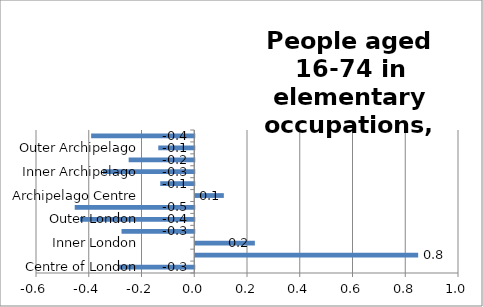
| Category | Series 0 |
|---|---|
| Centre of London | -0.285 |
| London Core | 0.845 |
| Inner London | 0.226 |
| London Suburbs | -0.276 |
| Outer London | -0.433 |
| London Edge | -0.453 |
| Archipelago Centre | 0.108 |
| Archipelago Core | -0.129 |
| Inner Archipelago | -0.346 |
| Archipelago Suburbs | -0.249 |
| Outer Archipelago | -0.136 |
| Archipelago Edge | -0.391 |